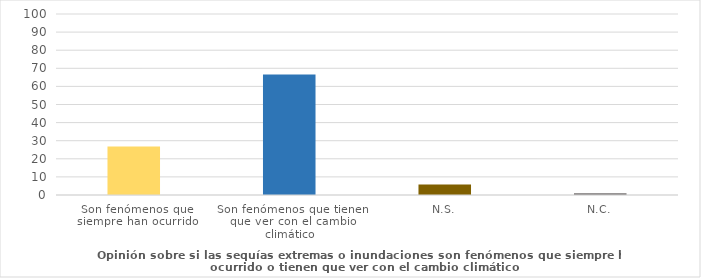
| Category | Series 0 |
|---|---|
| Son fenómenos que siempre han ocurrido | 26.765 |
| Son fenómenos que tienen que ver con el cambio climático | 66.577 |
| N.S. | 5.75 |
| N.C. | 0.908 |